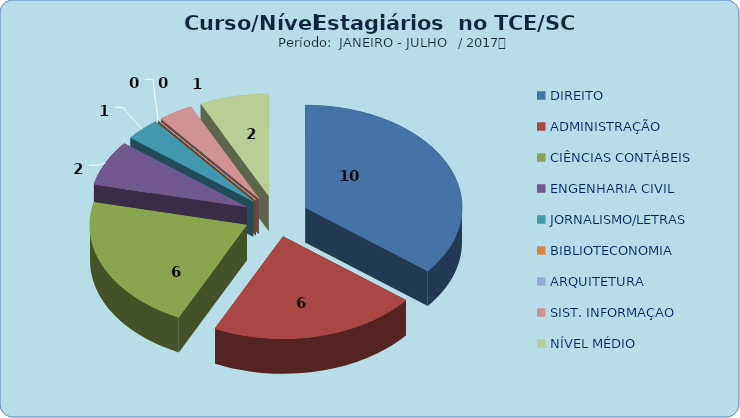
| Category | Series 0 |
|---|---|
| DIREITO | 10 |
| ADMINISTRAÇÃO | 6 |
| CIÊNCIAS CONTÁBEIS | 6 |
| ENGENHARIA CIVIL | 2 |
| JORNALISMO/LETRAS | 1 |
| BIBLIOTECONOMIA | 0 |
| ARQUITETURA | 0 |
| SIST. INFORMAÇAO | 1 |
| NÍVEL MÉDIO | 2 |